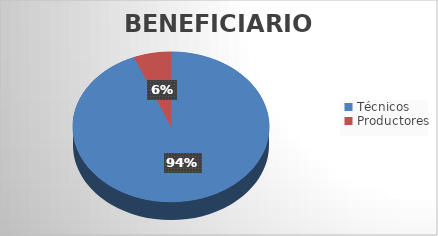
| Category | Series 0 |
|---|---|
| Técnicos | 291 |
| Productores | 19 |